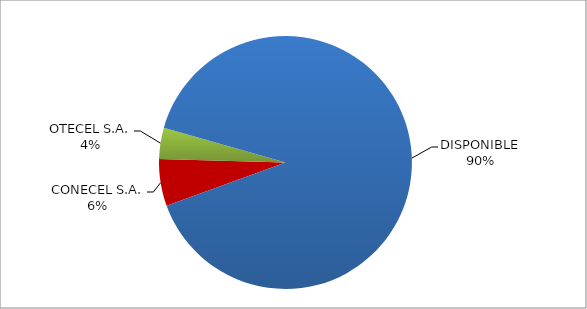
| Category | CÓDIGO DE RED 97 |
|---|---|
| CONECEL S.A. | 0.06 |
| OTECEL S.A. | 0.04 |
| DISPONIBLE | 0.9 |